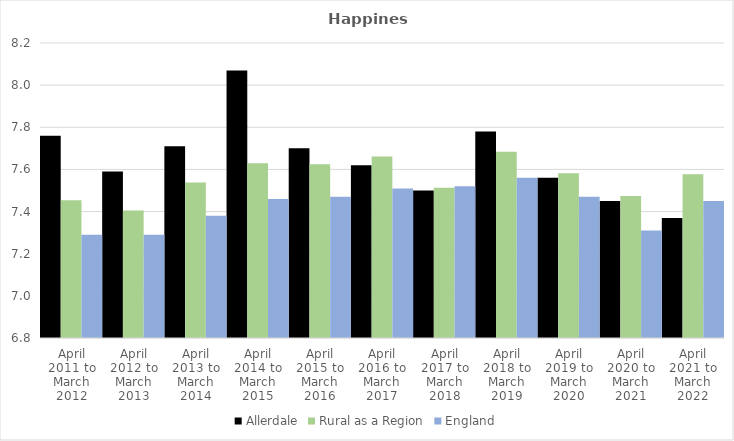
| Category | Allerdale | Rural as a Region | England |
|---|---|---|---|
| April 2011 to March 2012 | 7.76 | 7.454 | 7.29 |
| April 2012 to March 2013 | 7.59 | 7.406 | 7.29 |
| April 2013 to March 2014 | 7.71 | 7.539 | 7.38 |
| April 2014 to March 2015 | 8.07 | 7.63 | 7.46 |
| April 2015 to March 2016 | 7.7 | 7.625 | 7.47 |
| April 2016 to March 2017 | 7.62 | 7.661 | 7.51 |
| April 2017 to March 2018 | 7.5 | 7.513 | 7.52 |
| April 2018 to March 2019 | 7.78 | 7.684 | 7.56 |
| April 2019 to March 2020 | 7.56 | 7.582 | 7.47 |
| April 2020 to March 2021 | 7.45 | 7.474 | 7.31 |
| April 2021 to March 2022 | 7.37 | 7.577 | 7.45 |